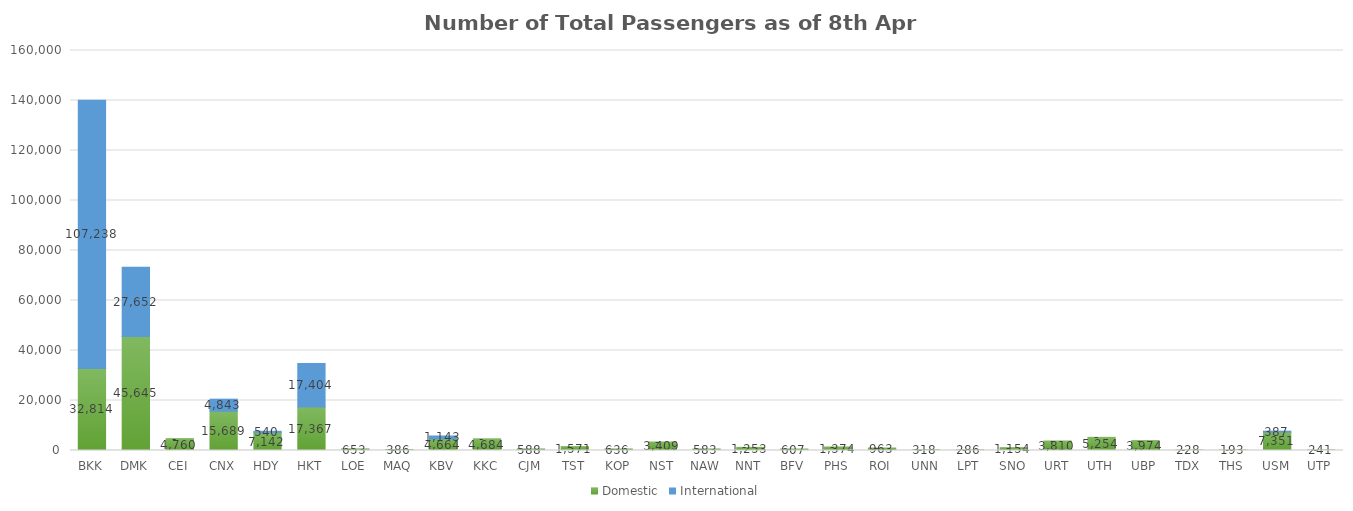
| Category | Domestic | International |
|---|---|---|
| BKK | 32814 | 107238 |
| DMK | 45645 | 27652 |
| CEI | 4760 | 0 |
| CNX | 15689 | 4843 |
| HDY | 7142 | 540 |
| HKT | 17367 | 17404 |
| LOE | 653 | 0 |
| MAQ | 386 | 0 |
| KBV | 4664 | 1143 |
| KKC | 4684 | 0 |
| CJM | 588 | 0 |
| TST | 1571 | 0 |
| KOP | 636 | 0 |
| NST | 3409 | 0 |
| NAW | 583 | 0 |
| NNT | 1253 | 0 |
| BFV | 607 | 0 |
| PHS | 1374 | 0 |
| ROI | 963 | 0 |
| UNN | 318 | 0 |
| LPT | 286 | 0 |
| SNO | 1154 | 0 |
| URT | 3810 | 0 |
| UTH | 5254 | 0 |
| UBP | 3974 | 0 |
| TDX | 228 | 0 |
| THS | 193 | 0 |
| USM | 7351 | 387 |
| UTP | 241 | 0 |